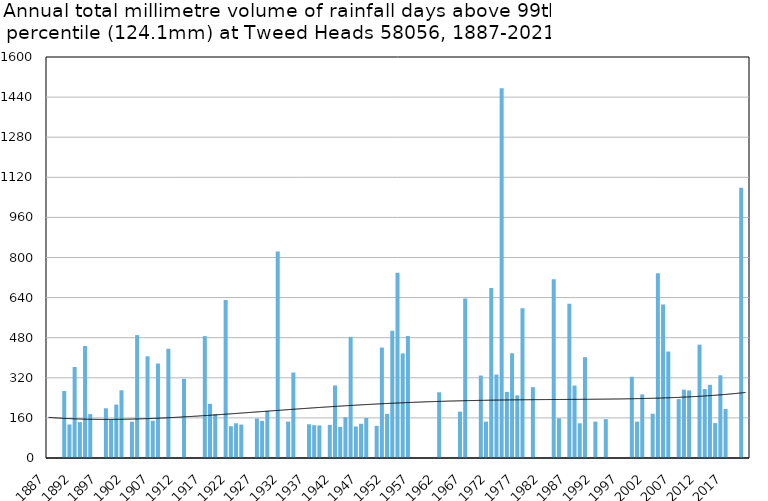
| Category | Annual total mm in days above 99th percentile |
|---|---|
| 1887 | 0 |
| 1888 | 0 |
| 1889 | 0 |
| 1890 | 267.5 |
| 1891 | 133.9 |
| 1892 | 363.2 |
| 1893 | 143 |
| 1894 | 447.1 |
| 1895 | 175 |
| 1896 | 0 |
| 1897 | 0 |
| 1898 | 198.4 |
| 1899 | 153.4 |
| 1900 | 213.1 |
| 1901 | 270.2 |
| 1902 | 0 |
| 1903 | 144.8 |
| 1904 | 490.3 |
| 1905 | 0 |
| 1906 | 405.9 |
| 1907 | 148.6 |
| 1908 | 376.9 |
| 1909 | 0 |
| 1910 | 436 |
| 1911 | 0 |
| 1912 | 0 |
| 1913 | 316 |
| 1914 | 0 |
| 1915 | 0 |
| 1916 | 0 |
| 1917 | 486.2 |
| 1918 | 216.2 |
| 1919 | 175.3 |
| 1920 | 0 |
| 1921 | 630.9 |
| 1922 | 127 |
| 1923 | 138.4 |
| 1924 | 133.4 |
| 1925 | 0 |
| 1926 | 0 |
| 1927 | 157.5 |
| 1928 | 148.1 |
| 1929 | 188 |
| 1930 | 0 |
| 1931 | 823.5 |
| 1932 | 0 |
| 1933 | 145.3 |
| 1934 | 340.9 |
| 1935 | 0 |
| 1936 | 0 |
| 1937 | 134.6 |
| 1938 | 130.8 |
| 1939 | 129.8 |
| 1940 | 0 |
| 1941 | 132.1 |
| 1942 | 289.5 |
| 1943 | 124.2 |
| 1944 | 162.8 |
| 1945 | 483.4 |
| 1946 | 125.7 |
| 1947 | 136.7 |
| 1948 | 159.5 |
| 1949 | 0 |
| 1950 | 128.3 |
| 1951 | 440.7 |
| 1952 | 176 |
| 1953 | 507.8 |
| 1954 | 739.4 |
| 1955 | 417.3 |
| 1956 | 486.9 |
| 1957 | 0 |
| 1958 | 0 |
| 1959 | 0 |
| 1960 | 0 |
| 1961 | 0 |
| 1962 | 262.2 |
| 1963 | 0 |
| 1964 | 0 |
| 1965 | 0 |
| 1966 | 184.9 |
| 1967 | 636.8 |
| 1968 | 0 |
| 1969 | 0 |
| 1970 | 329 |
| 1971 | 145.3 |
| 1972 | 677.9 |
| 1973 | 333 |
| 1974 | 1475.3 |
| 1975 | 263.8 |
| 1976 | 418 |
| 1977 | 250 |
| 1978 | 597.8 |
| 1979 | 0 |
| 1980 | 282.6 |
| 1981 | 0 |
| 1982 | 0 |
| 1983 | 0 |
| 1984 | 713.6 |
| 1985 | 158.4 |
| 1986 | 0 |
| 1987 | 615 |
| 1988 | 289.2 |
| 1989 | 138.6 |
| 1990 | 402.2 |
| 1991 | 0 |
| 1992 | 145.2 |
| 1993 | 0 |
| 1994 | 155 |
| 1995 | 0 |
| 1996 | 0 |
| 1997 | 0 |
| 1998 | 0 |
| 1999 | 324.1 |
| 2000 | 145.2 |
| 2001 | 253.6 |
| 2002 | 0 |
| 2003 | 176.6 |
| 2004 | 736.8 |
| 2005 | 612.8 |
| 2006 | 424.8 |
| 2007 | 0 |
| 2008 | 235 |
| 2009 | 272.6 |
| 2010 | 269.8 |
| 2011 | 0 |
| 2012 | 452.2 |
| 2013 | 275.4 |
| 2014 | 292 |
| 2015 | 139.4 |
| 2016 | 330 |
| 2017 | 195.6 |
| 2018 | 0 |
| 2019 | 0 |
| 2020 | 1078.2 |
| 2021 | 0 |